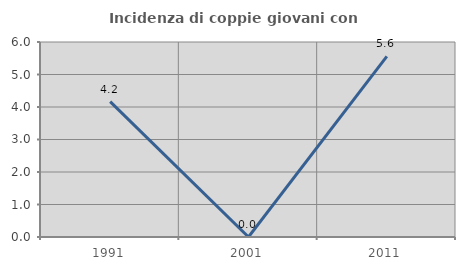
| Category | Incidenza di coppie giovani con figli |
|---|---|
| 1991.0 | 4.167 |
| 2001.0 | 0 |
| 2011.0 | 5.556 |